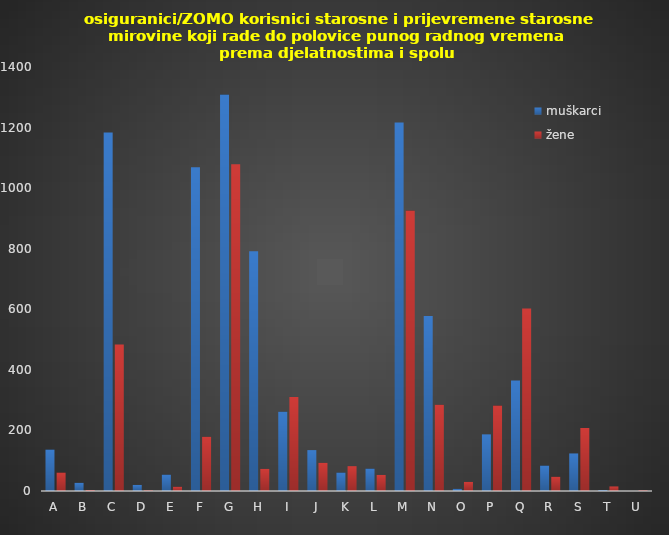
| Category | muškarci | žene |
|---|---|---|
| A | 137 | 61 |
| B | 27 | 3 |
| C | 1184 | 484 |
| D | 20 | 2 |
| E | 54 | 14 |
| F | 1069 | 179 |
| G | 1309 | 1079 |
| H | 792 | 73 |
| I | 262 | 310 |
| J | 135 | 93 |
| K | 61 | 82 |
| L | 74 | 53 |
| M | 1217 | 926 |
| N | 578 | 285 |
| O | 7 | 30 |
| P | 187 | 282 |
| Q | 365 | 603 |
| R | 84 | 47 |
| S | 124 | 208 |
| T | 3 | 15 |
| U | 0 | 2 |